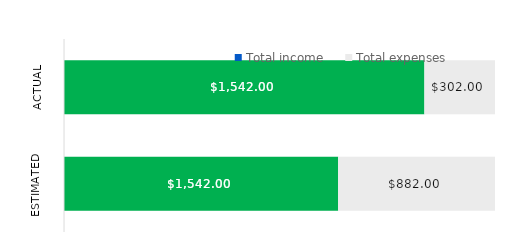
| Category | Total income | Total expenses |
|---|---|---|
| Estimated | 1542 | 882 |
| Actual | 1542 | 302 |